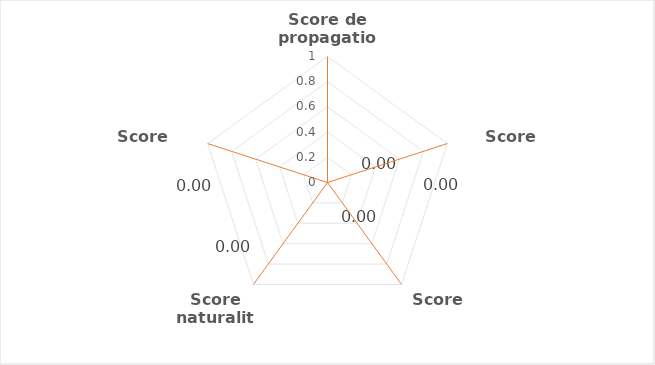
| Category | Series 0 |
|---|---|
| Score de propagation | 0 |
| Score Impact | 0 |
| Score CC | 0 |
| Score naturalité | 0 |
| Score gestion | 0 |